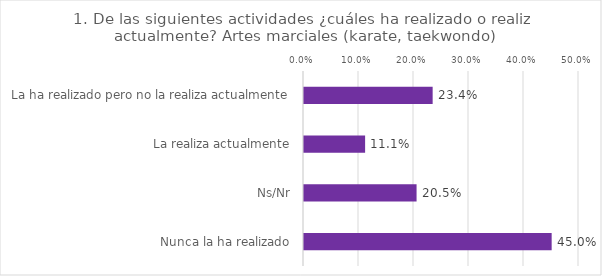
| Category | Series 0 |
|---|---|
| La ha realizado pero no la realiza actualmente | 0.234 |
| La realiza actualmente | 0.111 |
| Ns/Nr | 0.205 |
| Nunca la ha realizado | 0.45 |